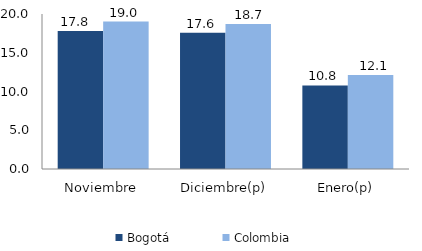
| Category | Bogotá | Colombia |
|---|---|---|
| Noviembre | 17.819 | 19.017 |
| Diciembre(p) | 17.575 | 18.718 |
| Enero(p) | 10.787 | 12.14 |